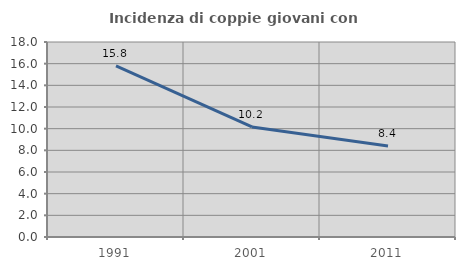
| Category | Incidenza di coppie giovani con figli |
|---|---|
| 1991.0 | 15.789 |
| 2001.0 | 10.156 |
| 2011.0 | 8.392 |